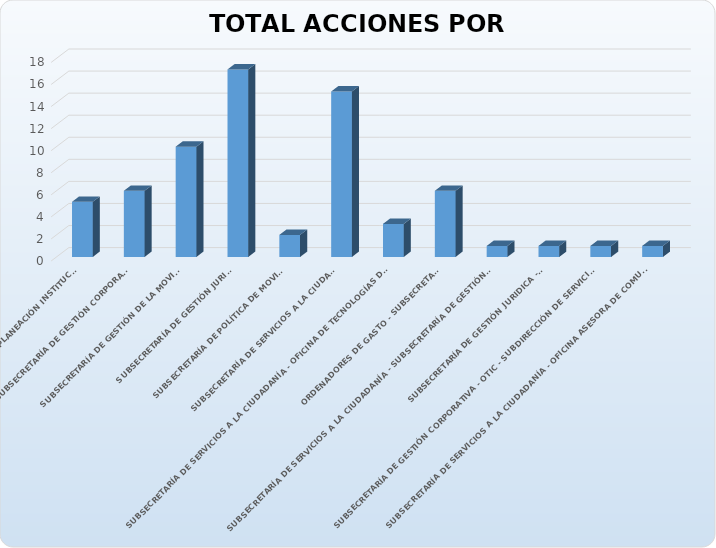
| Category | Total |
|---|---|
| OFICINA ASESORA DE PLANEACIÓN INSTITUCIONAL | 5 |
| SUBSECRETARÍA DE GESTIÓN CORPORATIVA  | 6 |
| SUBSECRETARÍA DE GESTIÓN DE LA MOVILIDAD | 10 |
| SUBSECRETARÍA DE GESTIÓN JURIDICA | 17 |
| SUBSECRETARÍA DE POLÍTICA DE MOVILIDAD | 2 |
| SUBSECRETARÍA DE SERVICIOS A LA CIUDADANÍA | 15 |
| SUBSECRETARÍA DE SERVICIOS A LA CIUDADANÍA - OFICINA DE TECNOLOGÍAS DE LA INFORMACIÓN Y LAS COMUNICACIONES | 3 |
| ORDENADORES DE GASTO - SUBSECRETARIOS | 6 |
| SUBSECRETARÍA DE SERVICIOS A LA CIUDADANÍA - SUBSECRETARÍA DE GESTIÓN CORPORATIVA -SUBSECRETARÍA DE GESTIÓN JURÍDICA - OTIC | 1 |
| SUBSECRETARÍA DE GESTIÓN JURIDICA - OTIC | 1 |
| SUBSECRETARÍA DE GESTIÓN CORPORATIVA - OTIC - SUBDIRECCIÓN DE SERVICIO A LA CIUDADANÍA | 1 |
| SUBSECRETARÍA DE SERVICIOS A LA CIUDADANÍA - OFICINA ASESORA DE COMUNICACIONES Y CULTURA PARA LA MOVILIDAD - SUBSECRETARÍA DE GESTIÓN DE LA MOVILIDAD  | 1 |